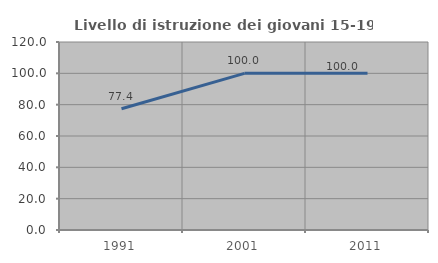
| Category | Livello di istruzione dei giovani 15-19 anni |
|---|---|
| 1991.0 | 77.419 |
| 2001.0 | 100 |
| 2011.0 | 100 |